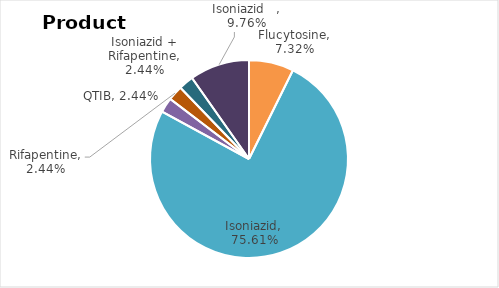
| Category | Total |
|---|---|
| Flucytosine | 0.073 |
| Isoniazid | 0.756 |
| QTIB | 0.024 |
| Rifapentine | 0.024 |
| Isoniazid + Rifapentine | 0.024 |
| Isoniazid    | 0.098 |